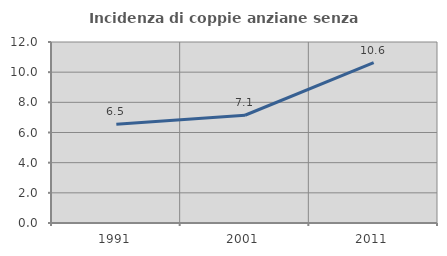
| Category | Incidenza di coppie anziane senza figli  |
|---|---|
| 1991.0 | 6.54 |
| 2001.0 | 7.143 |
| 2011.0 | 10.631 |